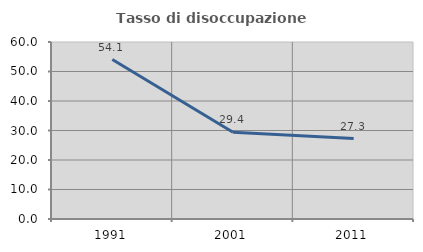
| Category | Tasso di disoccupazione giovanile  |
|---|---|
| 1991.0 | 54.054 |
| 2001.0 | 29.412 |
| 2011.0 | 27.273 |